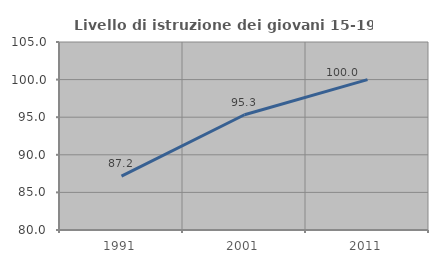
| Category | Livello di istruzione dei giovani 15-19 anni |
|---|---|
| 1991.0 | 87.156 |
| 2001.0 | 95.322 |
| 2011.0 | 100 |